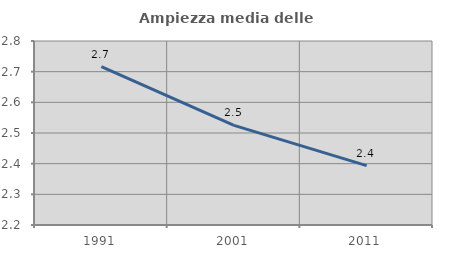
| Category | Ampiezza media delle famiglie |
|---|---|
| 1991.0 | 2.716 |
| 2001.0 | 2.525 |
| 2011.0 | 2.393 |